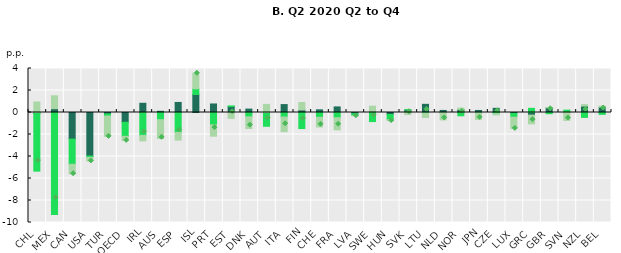
| Category | Unemployment | Marginally attached persons | Other inactivity |
|---|---|---|---|
| CHL | -0.083 | -5.247 | 0.958 |
| MEX | 0.347 | -9.264 | 1.172 |
| CAN | -2.421 | -2.287 | -0.857 |
| USA | -3.953 | -0.128 | -0.318 |
| TUR | -0.135 | -0.192 | -1.842 |
| OECD | -0.887 | -1.279 | -0.368 |
| IRL | 0.837 | -2.082 | -0.498 |
| AUS | 0.109 | -0.657 | -1.706 |
| ESP | 0.915 | -1.811 | -0.699 |
| ISL | 1.636 | 0.521 | 1.412 |
| PRT | 0.777 | -1.129 | -1.023 |
| EST | 0.54 | 0.062 | -0.532 |
| DNK | 0.309 | -0.389 | -1.067 |
| AUT | -0.062 | -1.19 | 0.739 |
| ITA | 0.72 | -0.409 | -1.334 |
| FIN | 0.232 | -1.46 | 0.675 |
| CHE | 0.242 | -0.439 | -0.876 |
| FRA | 0.507 | -0.473 | -1.102 |
| LVA | -0.103 | -0.172 | -0.018 |
| SWE | 0.107 | -0.825 | 0.469 |
| HUN | -0.178 | -0.465 | -0.097 |
| SVK | 0.237 | 0.019 | -0.187 |
| LTU | 0.743 | -0.057 | -0.399 |
| NLD | 0.188 | -0.011 | -0.664 |
| NOR | 0.272 | -0.299 | 0.126 |
| JPN | 0.186 | -0.04 | -0.587 |
| CZE | 0.379 | -0.098 | -0.126 |
| LUX | -0.076 | -0.351 | -1.017 |
| GRC | -0.238 | 0.379 | -0.792 |
| GBR | 0.423 | -0.111 | 0.029 |
| SVN | 0.012 | 0.204 | -0.716 |
| NZL | 0.582 | -0.447 | 0.134 |
| BEL | 0.476 | -0.17 | 0.1 |